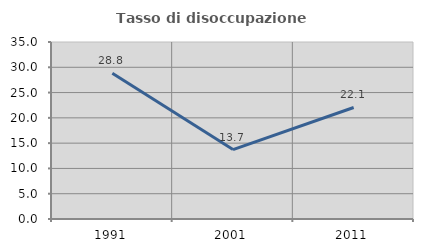
| Category | Tasso di disoccupazione giovanile  |
|---|---|
| 1991.0 | 28.817 |
| 2001.0 | 13.734 |
| 2011.0 | 22.051 |